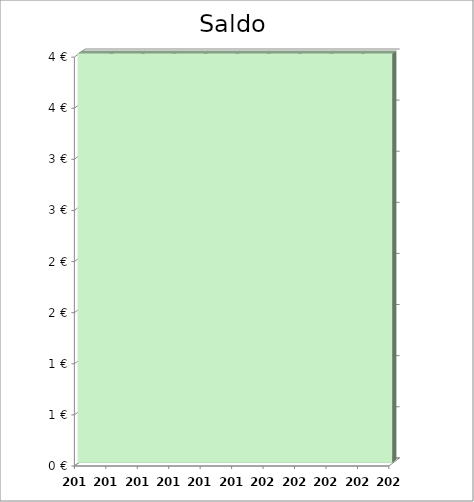
| Category | Saldo |
|---|---|
| 2014.0 | 4 |
| 2015.0 | 4 |
| 2016.0 | 4 |
| 2017.0 | 4 |
| 2018.0 | 4 |
| 2019.0 | 4 |
| 2020.0 | 4 |
| 2021.0 | 4 |
| 2022.0 | 4 |
| 2023.0 | 4 |
| 2024.0 | 4 |